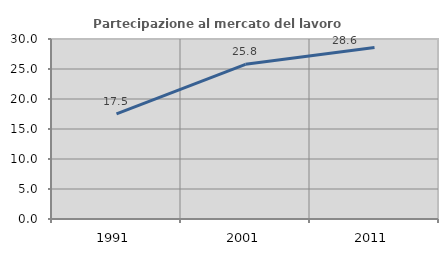
| Category | Partecipazione al mercato del lavoro  femminile |
|---|---|
| 1991.0 | 17.536 |
| 2001.0 | 25.773 |
| 2011.0 | 28.571 |